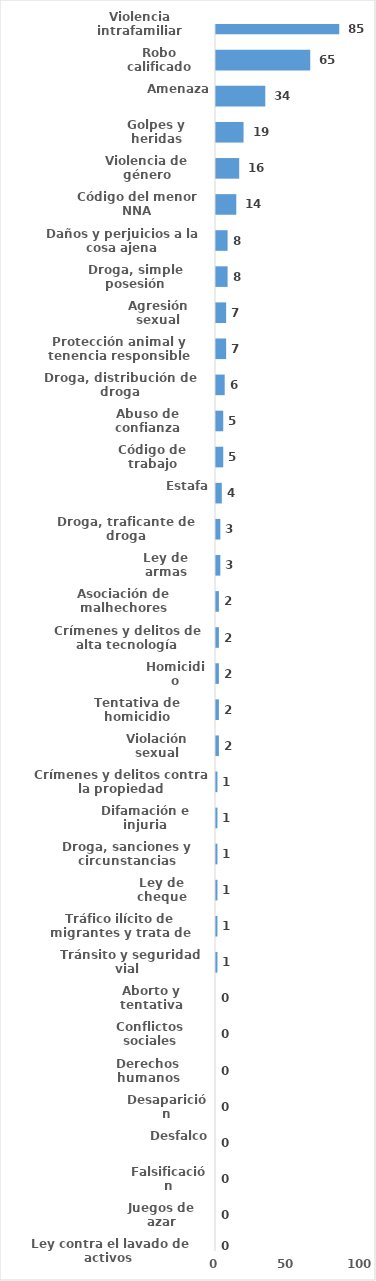
| Category | Series 0 |
|---|---|
| Violencia intrafamiliar | 85 |
| Robo calificado | 65 |
| Amenaza | 34 |
| Golpes y heridas | 19 |
| Violencia de género | 16 |
| Código del menor NNA | 14 |
| Daños y perjuicios a la cosa ajena | 8 |
| Droga, simple posesión | 8 |
| Agresión sexual | 7 |
| Protección animal y tenencia responsible | 7 |
| Droga, distribución de droga | 6 |
| Abuso de confianza | 5 |
| Código de trabajo | 5 |
| Estafa | 4 |
| Droga, traficante de droga | 3 |
| Ley de armas | 3 |
| Asociación de malhechores | 2 |
| Crímenes y delitos de alta tecnología | 2 |
| Homicidio | 2 |
| Tentativa de homicidio | 2 |
| Violación sexual | 2 |
| Crímenes y delitos contra la propiedad | 1 |
| Difamación e injuria | 1 |
| Droga, sanciones y circunstancias agravantes | 1 |
| Ley de cheque | 1 |
| Tráfico ilícito de migrantes y trata de personas | 1 |
| Tránsito y seguridad vial  | 1 |
| Aborto y tentativa | 0 |
| Conflictos sociales | 0 |
| Derechos humanos | 0 |
| Desaparición | 0 |
| Desfalco | 0 |
| Falsificación | 0 |
| Juegos de azar | 0 |
| Ley contra el lavado de activos  | 0 |